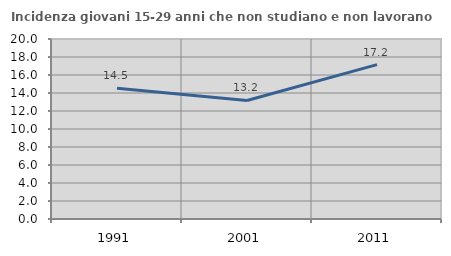
| Category | Incidenza giovani 15-29 anni che non studiano e non lavorano  |
|---|---|
| 1991.0 | 14.516 |
| 2001.0 | 13.172 |
| 2011.0 | 17.151 |